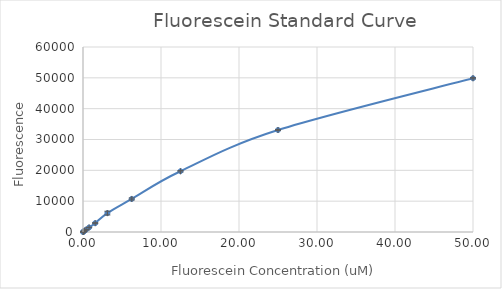
| Category | Series 0 |
|---|---|
| 50.0 | 49867.25 |
| 25.0 | 33077.25 |
| 12.5 | 19706.5 |
| 6.25 | 10716 |
| 3.125 | 6128.25 |
| 1.5625 | 2870.25 |
| 0.78125 | 1463.5 |
| 0.390625 | 749 |
| 0.1953125 | 384.5 |
| 0.09765625 | 192.25 |
| 0.048828125 | 96.75 |
| 0.0 | 2 |